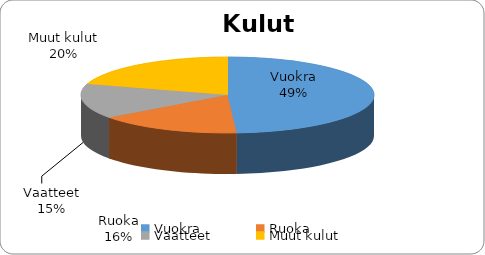
| Category | Yhteensä |
|---|---|
| Vuokra | 2000 |
| Ruoka | 650 |
| Vaatteet | 600 |
| Muut kulut | 830 |